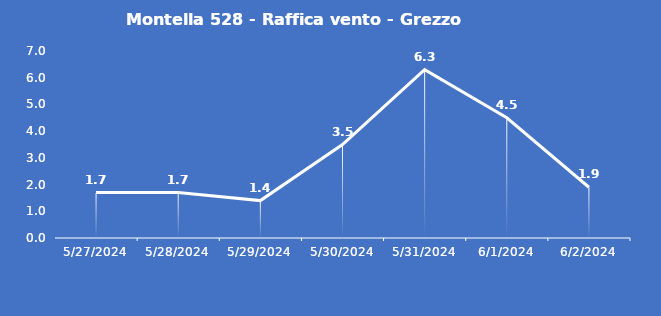
| Category | Montella 528 - Raffica vento - Grezzo (m/s) |
|---|---|
| 5/27/24 | 1.7 |
| 5/28/24 | 1.7 |
| 5/29/24 | 1.4 |
| 5/30/24 | 3.5 |
| 5/31/24 | 6.3 |
| 6/1/24 | 4.5 |
| 6/2/24 | 1.9 |